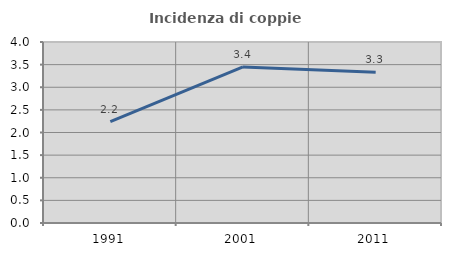
| Category | Incidenza di coppie miste |
|---|---|
| 1991.0 | 2.242 |
| 2001.0 | 3.448 |
| 2011.0 | 3.333 |